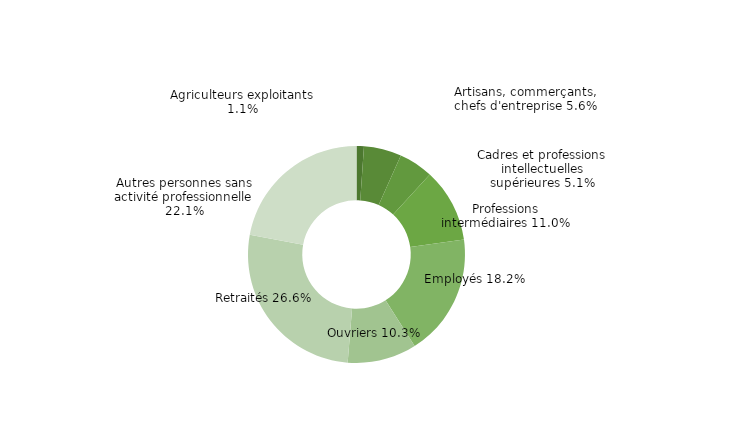
| Category | Haute-Corse |
|---|---|
| Agriculteurs exploitants | 0.011 |
| Artisans, commerçants, chefs d'entreprise | 0.056 |
| Cadres et professions intellectuelles supérieures | 0.051 |
| Professions intermédiaires | 0.11 |
| Employés | 0.182 |
| Ouvriers | 0.103 |
| Retraités | 0.266 |
| Autres personnes sans activité professionnelle | 0.221 |